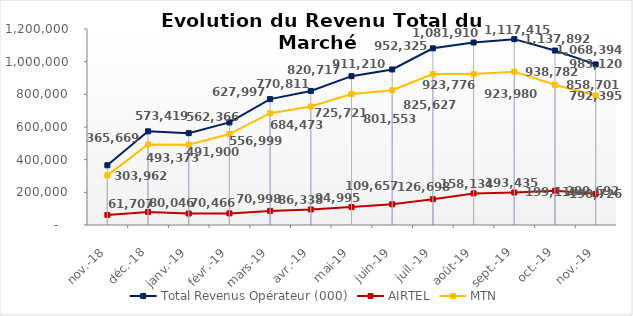
| Category | Total Revenus Opérateur (000) | AIRTEL | MTN |
|---|---|---|---|
| nov.-18 | 365668.685 | 61707.158 | 303961.527 |
| déc.-18 | 573419.12 | 80045.791 | 493373.329 |
| janv.-19 | 562366.213 | 70466.278 | 491899.935 |
| févr.-19 | 627996.845 | 70997.883 | 556998.962 |
| mars-19 | 770811.009 | 86338.276 | 684472.733 |
| avr.-19 | 820716.897 | 94995.423 | 725721.474 |
| mai-19 | 911210.203 | 109657.206 | 801552.997 |
| juin-19 | 952324.971 | 126697.659 | 825627.311 |
| juil.-19 | 1081909.748 | 158133.854 | 923775.894 |
| août-19 | 1117414.52 | 193434.664 | 923979.856 |
| sept.-19 | 1137891.829 | 199109.547 | 938782.282 |
| oct.-19 | 1068393.827 | 209692.439 | 858701.388 |
| nov.-19 | 983120.259 | 190725.62 | 792394.639 |